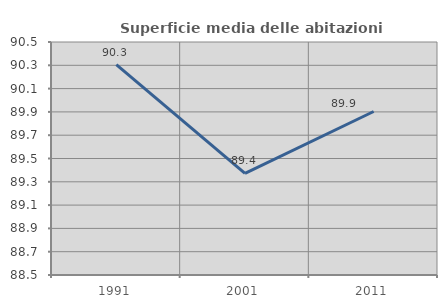
| Category | Superficie media delle abitazioni occupate |
|---|---|
| 1991.0 | 90.305 |
| 2001.0 | 89.373 |
| 2011.0 | 89.903 |